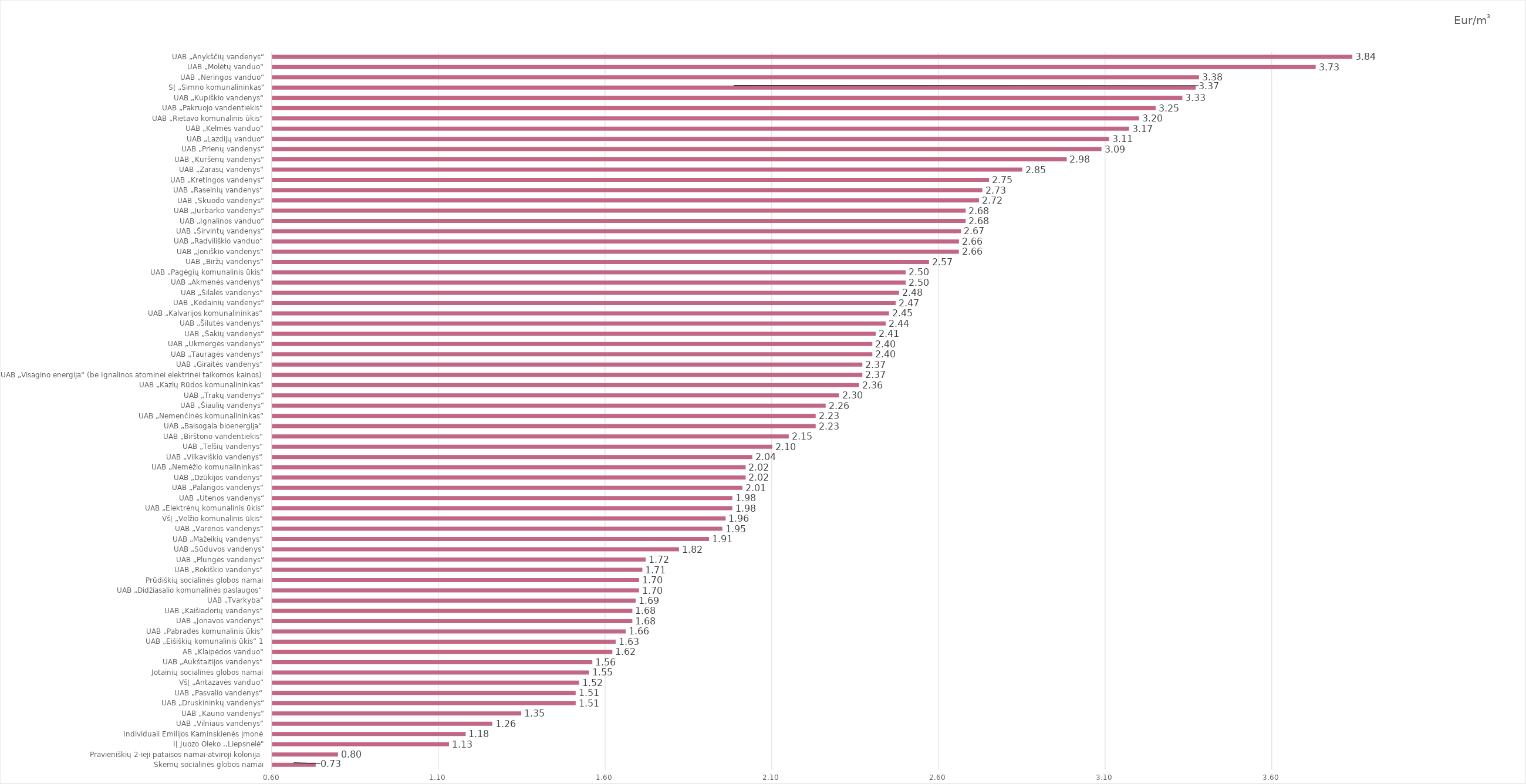
| Category | Eur/m3
 be PVM |
|---|---|
| Skemų socialinės globos namai | 0.73 |
| Pravieniškių 2-ieji pataisos namai-atviroji kolonija | 0.797 |
| IĮ Juozo Oleko ,,Liepsnelė" | 1.13 |
| Individuali Emilijos Kaminskienės įmonė | 1.18 |
| UAB „Vilniaus vandenys“ | 1.26 |
| UAB „Kauno vandenys“ | 1.347 |
| UAB „Druskininkų vandenys“ | 1.51 |
| UAB „Pasvalio vandenys“ | 1.51 |
| VšĮ „Antazavės vanduo“ | 1.52 |
| Jotainių socialinės globos namai | 1.55 |
| UAB „Aukštaitijos vandenys“ | 1.56 |
| AB „Klaipėdos vanduo“ | 1.62 |
| UAB „Eišiškių komunalinis ūkis“ 1 | 1.63 |
| UAB „Pabradės komunalinis ūkis“ | 1.66 |
| UAB „Jonavos vandenys“ | 1.68 |
| UAB „Kaišiadorių vandenys“ | 1.68 |
| UAB „Tvarkyba“ | 1.69 |
| UAB „Didžiasalio komunalinės paslaugos“ | 1.7 |
| Prūdiškių socialinės globos namai | 1.7 |
| UAB „Rokiškio vandenys“ | 1.71 |
| UAB „Plungės vandenys“ | 1.72 |
| UAB „Sūduvos vandenys“ | 1.82 |
| UAB „Mažeikių vandenys“ | 1.91 |
| UAB „Varėnos vandenys“ | 1.95 |
| VšĮ „Velžio komunalinis ūkis“ | 1.96 |
| UAB „Elektrėnų komunalinis ūkis“ | 1.98 |
| UAB „Utenos vandenys“ | 1.98 |
| UAB „Palangos vandenys“ | 2.01 |
| UAB „Dzūkijos vandenys“ | 2.02 |
| UAB „Nemėžio komunalininkas“ | 2.02 |
| UAB „Vilkaviškio vandenys“ | 2.04 |
| UAB „Telšių vandenys“ | 2.1 |
| UAB „Birštono vandentiekis“ | 2.149 |
| UAB „Baisogala bioenergija“ | 2.23 |
| UAB „Nemenčinės komunalininkas“ | 2.23 |
| UAB „Šiaulių vandenys“ | 2.26 |
| UAB „Trakų vandenys“ | 2.3 |
| UAB „Kazlų Rūdos komunalininkas“ | 2.36 |
| UAB „Visagino energija“ (be Ignalinos atominei elektrinei taikomos kainos) | 2.37 |
| UAB „Giraitės vandenys“ | 2.37 |
| UAB „Tauragės vandenys“ | 2.4 |
| UAB „Ukmergės vandenys“ | 2.4 |
| UAB „Šakių vandenys“ | 2.41 |
| UAB „Šilutės vandenys“ | 2.44 |
| UAB „Kalvarijos komunalininkas“ | 2.45 |
| UAB „Kėdainių vandenys“ | 2.47 |
| UAB „Šilalės vandenys“ | 2.48 |
| UAB „Akmenės vandenys“ | 2.5 |
| UAB „Pagėgių komunalinis ūkis“ | 2.5 |
| UAB „Biržų vandenys“ | 2.57 |
| UAB „Joniškio vandenys“ | 2.659 |
| UAB „Radviliškio vanduo“ | 2.66 |
| UAB „Širvintų vandenys“ | 2.666 |
| UAB „Ignalinos vanduo“ | 2.68 |
| UAB „Jurbarko vandenys“ | 2.68 |
| UAB „Skuodo vandenys“ | 2.72 |
| UAB „Raseinių vandenys“ | 2.73 |
| UAB „Kretingos vandenys“ | 2.75 |
| UAB „Zarasų vandenys“ | 2.85 |
| UAB „Kuršėnų vandenys“ | 2.983 |
| UAB „Prienų vandenys“ | 3.087 |
| UAB „Lazdijų vanduo“ | 3.11 |
| UAB „Kelmės vanduo“ | 3.17 |
| UAB „Rietavo komunalinis ūkis“ | 3.2 |
| UAB „Pakruojo vandentiekis“ | 3.25 |
| UAB „Kupiškio vandenys“ | 3.33 |
| SĮ „Simno komunalininkas“ | 3.37 |
| UAB „Neringos vanduo“ | 3.38 |
| UAB „Molėtų vanduo“ | 3.73 |
| UAB „Anykščių vandenys“ | 3.84 |